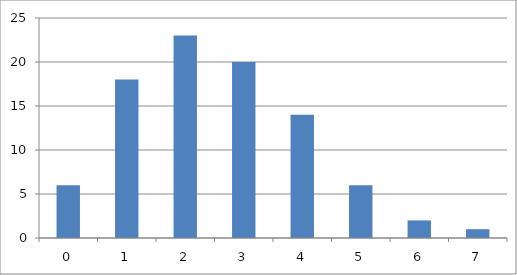
| Category | Series 0 |
|---|---|
| 0.0 | 6 |
| 1.0 | 18 |
| 2.0 | 23 |
| 3.0 | 20 |
| 4.0 | 14 |
| 5.0 | 6 |
| 6.0 | 2 |
| 7.0 | 1 |